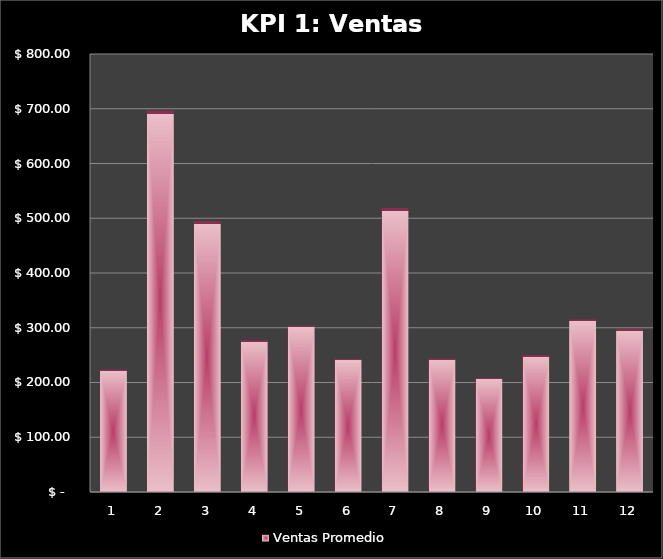
| Category | Ventas Promedio  |
|---|---|
| 0 | 223.698 |
| 1 | 696.483 |
| 2 | 494.574 |
| 3 | 277.335 |
| 4 | 303.518 |
| 5 | 242.772 |
| 6 | 518.91 |
| 7 | 243.325 |
| 8 | 208.335 |
| 9 | 249.635 |
| 10 | 315.264 |
| 11 | 297.716 |